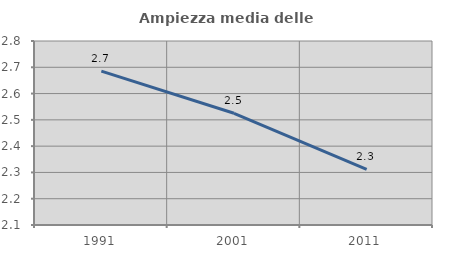
| Category | Ampiezza media delle famiglie |
|---|---|
| 1991.0 | 2.685 |
| 2001.0 | 2.525 |
| 2011.0 | 2.312 |